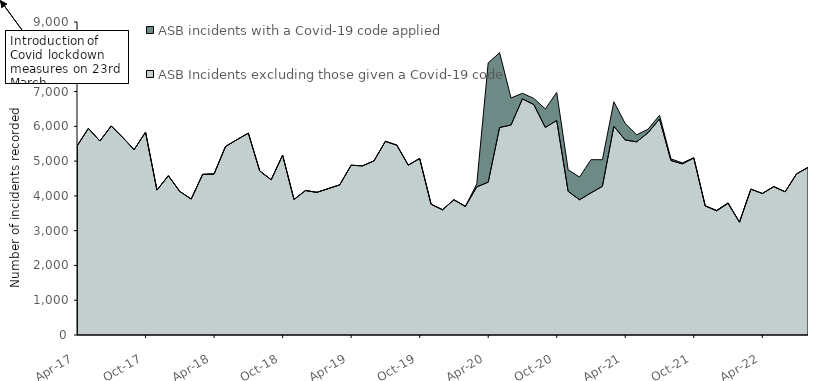
| Category | ASB Incidents excluding those given a Covid-19 code | ASB incidents with a Covid-19 code applied |
|---|---|---|
| 2017-04-01 | 5433 | 0 |
| 2017-05-01 | 5941 | 0 |
| 2017-06-01 | 5577 | 0 |
| 2017-07-01 | 6012 | 0 |
| 2017-08-01 | 5681 | 0 |
| 2017-09-01 | 5329 | 0 |
| 2017-10-01 | 5832 | 0 |
| 2017-11-01 | 4167 | 0 |
| 2017-12-01 | 4580 | 0 |
| 2018-01-01 | 4127 | 0 |
| 2018-02-01 | 3909 | 0 |
| 2018-03-01 | 4619 | 0 |
| 2018-04-01 | 4631 | 0 |
| 2018-05-01 | 5420 | 0 |
| 2018-06-01 | 5616 | 0 |
| 2018-07-01 | 5805 | 0 |
| 2018-08-01 | 4716 | 0 |
| 2018-09-01 | 4464 | 0 |
| 2018-10-01 | 5172 | 0 |
| 2018-11-01 | 3896 | 0 |
| 2018-12-01 | 4154 | 0 |
| 2019-01-01 | 4102 | 0 |
| 2019-02-01 | 4209 | 0 |
| 2019-03-01 | 4318 | 0 |
| 2019-04-01 | 4881 | 0 |
| 2019-05-01 | 4864 | 0 |
| 2019-06-01 | 5007 | 0 |
| 2019-07-01 | 5570 | 0 |
| 2019-08-01 | 5459 | 0 |
| 2019-09-01 | 4884 | 0 |
| 2019-10-01 | 5076 | 0 |
| 2019-11-01 | 3759 | 0 |
| 2019-12-01 | 3601 | 0 |
| 2020-01-01 | 3888 | 0 |
| 2020-02-01 | 3698 | 0 |
| 2020-03-01 | 4258 | 86 |
| 2020-04-01 | 4394 | 3431 |
| 2020-05-01 | 5967 | 2149 |
| 2020-06-01 | 6037 | 779 |
| 2020-07-01 | 6791 | 159 |
| 2020-08-01 | 6624 | 177 |
| 2020-09-01 | 5968 | 532 |
| 2020-10-01 | 6167 | 808 |
| 2020-11-01 | 4130 | 621 |
| 2020-12-01 | 3889 | 652 |
| 2021-01-01 | 4086 | 955 |
| 2021-02-01 | 4275 | 765 |
| 2021-03-01 | 6001 | 706 |
| 2021-04-01 | 5608 | 471 |
| 2021-05-01 | 5554 | 203 |
| 2021-06-01 | 5818 | 102 |
| 2021-07-01 | 6211 | 107 |
| 2021-08-01 | 5016 | 49 |
| 2021-09-01 | 4922 | 27 |
| 2021-10-01 | 5090 | 9 |
| 2021-11-01 | 3712 | 5 |
| 2021-12-01 | 3569 | 16 |
| 2022-01-01 | 3786 | 16 |
| 2022-02-01 | 3245 | 1 |
| 2022-03-01 | 4194 | 1 |
| 2022-04-01 | 4069 | 0 |
| 2022-05-01 | 4267 | 0 |
| 2022-06-01 | 4118 | 0 |
| 2022-07-01 | 4634 | 0 |
| 2022-08-01 | 4818 | 0 |